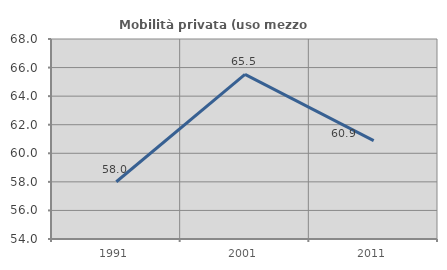
| Category | Mobilità privata (uso mezzo privato) |
|---|---|
| 1991.0 | 58.008 |
| 2001.0 | 65.525 |
| 2011.0 | 60.891 |